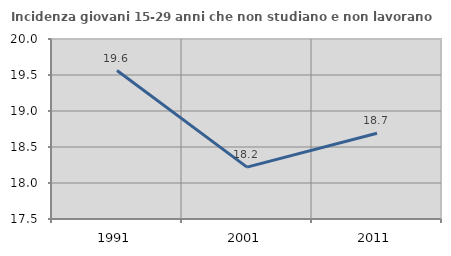
| Category | Incidenza giovani 15-29 anni che non studiano e non lavorano  |
|---|---|
| 1991.0 | 19.562 |
| 2001.0 | 18.22 |
| 2011.0 | 18.692 |